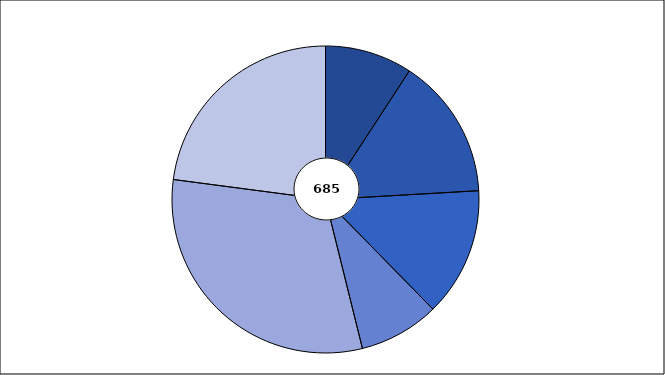
| Category | Series 1 |
|---|---|
| 0 | 63 |
| 1 | 102 |
| 2 | 93 |
| 3 | 58 |
| 4 | 212 |
| 5 | 157 |